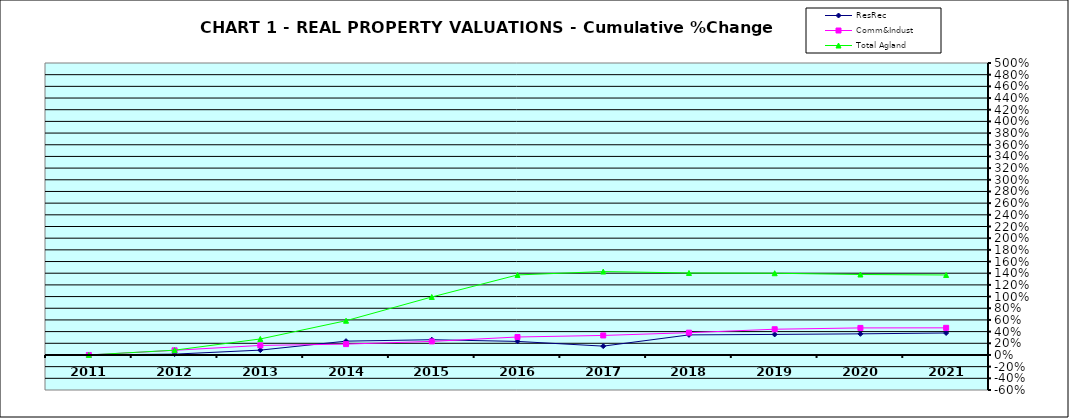
| Category | ResRec | Comm&Indust | Total Agland |
|---|---|---|---|
| 2011.0 | 0 | 0 | 0 |
| 2012.0 | 0.014 | 0.08 | 0.082 |
| 2013.0 | 0.083 | 0.163 | 0.274 |
| 2014.0 | 0.237 | 0.186 | 0.587 |
| 2015.0 | 0.261 | 0.232 | 0.993 |
| 2016.0 | 0.232 | 0.308 | 1.371 |
| 2017.0 | 0.151 | 0.334 | 1.428 |
| 2018.0 | 0.344 | 0.382 | 1.404 |
| 2019.0 | 0.352 | 0.441 | 1.4 |
| 2020.0 | 0.362 | 0.463 | 1.378 |
| 2021.0 | 0.376 | 0.465 | 1.37 |